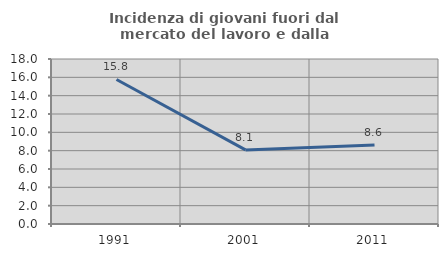
| Category | Incidenza di giovani fuori dal mercato del lavoro e dalla formazione  |
|---|---|
| 1991.0 | 15.769 |
| 2001.0 | 8.081 |
| 2011.0 | 8.607 |